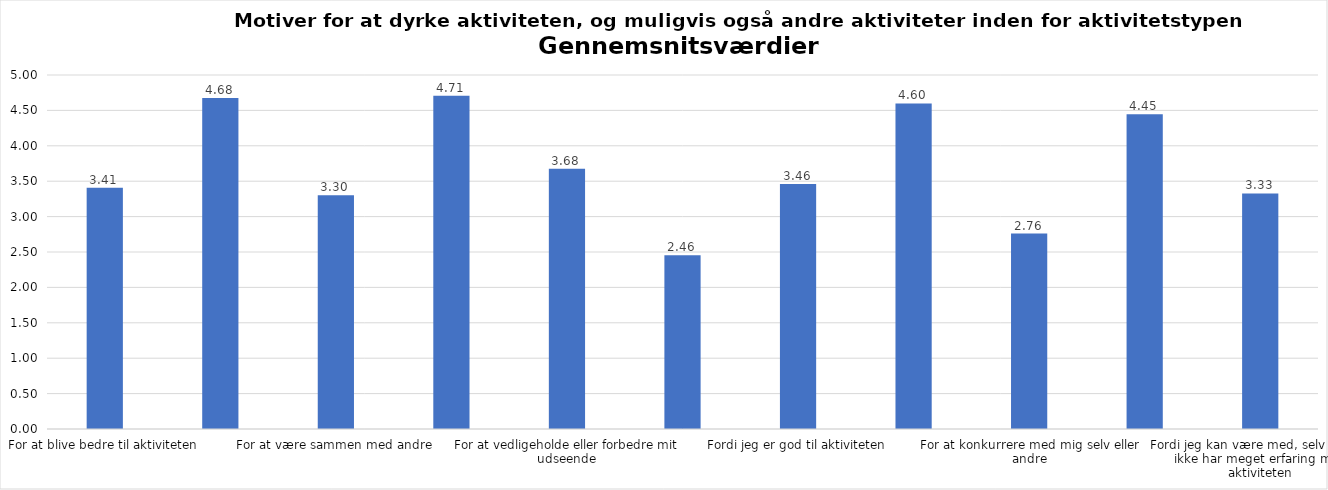
| Category | Gennemsnit |
|---|---|
| For at blive bedre til aktiviteten | 3.407 |
| For at vedligeholde eller forbedre min sundhed (fx helbred, fysisk form) | 4.676 |
| For at være sammen med andre | 3.301 |
| For at gøre noget godt for mig selv | 4.707 |
| For at vedligeholde eller forbedre mit udseende | 3.676 |
| Fordi andre i min omgangskreds opmuntrer mig til det | 2.456 |
| Fordi jeg er god til aktiviteten | 3.459 |
| Fordi jeg godt kan lide aktiviteten | 4.599 |
| For at konkurrere med mig selv eller andre | 2.761 |
| Fordi aktiviteten passer godt ind i min hverdag | 4.446 |
| Fordi jeg kan være med, selv om jeg ikke har meget erfaring med aktiviteten | 3.327 |